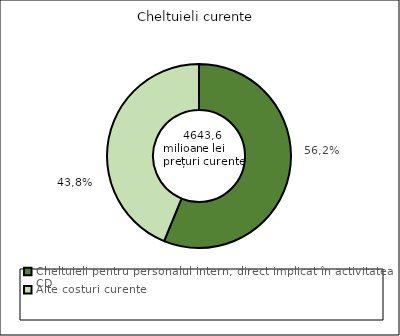
| Category | Series 0 |
|---|---|
| Cheltuieli pentru personalul intern, direct implicat în activitatea CD | 0.562 |
| Alte costuri curente | 0.438 |